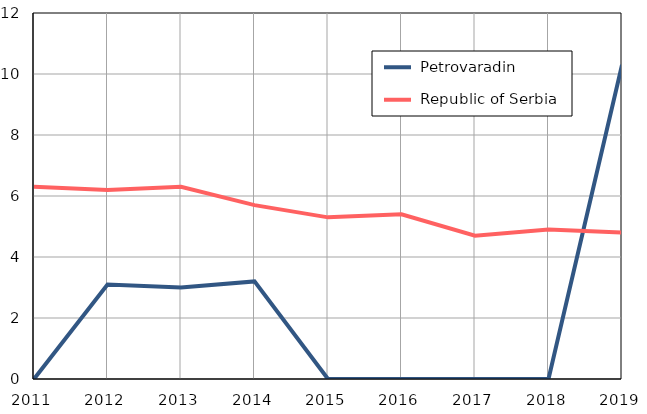
| Category |  Petrovaradin |  Republic of Serbia |
|---|---|---|
| 2011.0 | 0 | 6.3 |
| 2012.0 | 3.1 | 6.2 |
| 2013.0 | 3 | 6.3 |
| 2014.0 | 3.2 | 5.7 |
| 2015.0 | 0 | 5.3 |
| 2016.0 | 0 | 5.4 |
| 2017.0 | 0 | 4.7 |
| 2018.0 | 0 | 4.9 |
| 2019.0 | 10.3 | 4.8 |